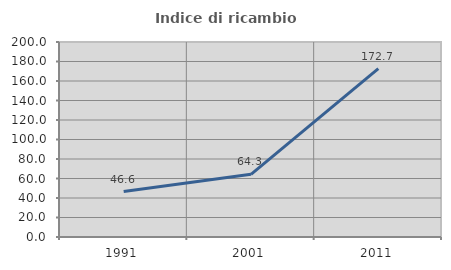
| Category | Indice di ricambio occupazionale  |
|---|---|
| 1991.0 | 46.593 |
| 2001.0 | 64.286 |
| 2011.0 | 172.684 |